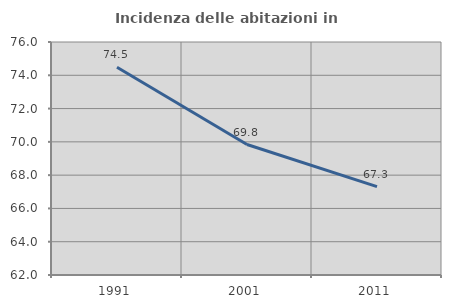
| Category | Incidenza delle abitazioni in proprietà  |
|---|---|
| 1991.0 | 74.481 |
| 2001.0 | 69.841 |
| 2011.0 | 67.311 |